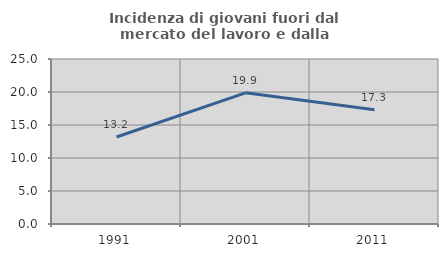
| Category | Incidenza di giovani fuori dal mercato del lavoro e dalla formazione  |
|---|---|
| 1991.0 | 13.182 |
| 2001.0 | 19.88 |
| 2011.0 | 17.308 |